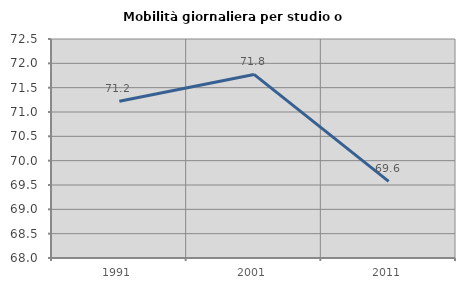
| Category | Mobilità giornaliera per studio o lavoro |
|---|---|
| 1991.0 | 71.22 |
| 2001.0 | 71.772 |
| 2011.0 | 69.576 |